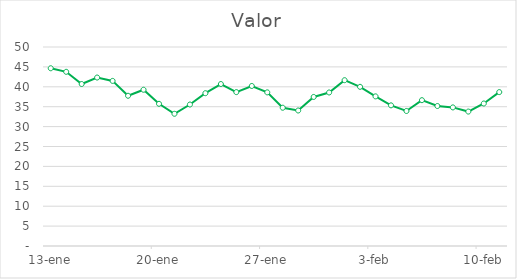
| Category | Valor |
|---|---|
| 2014-01-13 | 44.657 |
| 2014-01-14 | 43.764 |
| 2014-01-15 | 40.701 |
| 2014-01-16 | 42.329 |
| 2014-01-17 | 41.482 |
| 2014-01-18 | 37.749 |
| 2014-01-19 | 39.259 |
| 2014-01-20 | 35.725 |
| 2014-01-21 | 33.225 |
| 2014-01-22 | 35.55 |
| 2014-01-23 | 38.394 |
| 2014-01-24 | 40.698 |
| 2014-01-25 | 38.663 |
| 2014-01-26 | 40.21 |
| 2014-01-27 | 38.601 |
| 2014-01-28 | 34.741 |
| 2014-01-29 | 34.046 |
| 2014-01-30 | 37.451 |
| 2014-01-31 | 38.574 |
| 2014-02-01 | 41.66 |
| 2014-02-02 | 39.994 |
| 2014-02-03 | 37.594 |
| 2014-02-04 | 35.339 |
| 2014-02-05 | 33.925 |
| 2014-02-06 | 36.639 |
| 2014-02-07 | 35.174 |
| 2014-02-08 | 34.822 |
| 2014-02-09 | 33.777 |
| 2014-02-10 | 35.804 |
| 2014-02-11 | 38.668 |